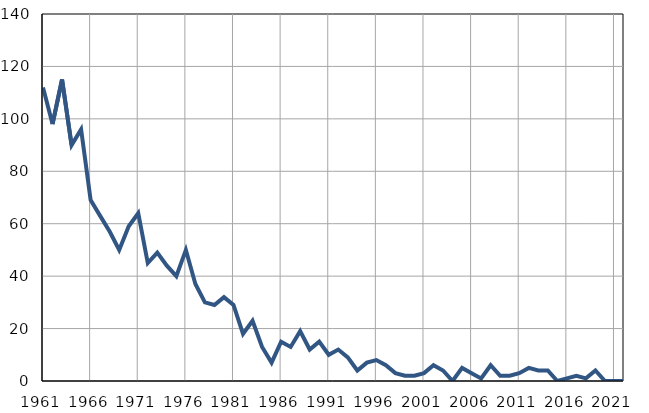
| Category | Infants
deaths |
|---|---|
| 1961.0 | 112 |
| 1962.0 | 98 |
| 1963.0 | 115 |
| 1964.0 | 90 |
| 1965.0 | 96 |
| 1966.0 | 69 |
| 1967.0 | 63 |
| 1968.0 | 57 |
| 1969.0 | 50 |
| 1970.0 | 59 |
| 1971.0 | 64 |
| 1972.0 | 45 |
| 1973.0 | 49 |
| 1974.0 | 44 |
| 1975.0 | 40 |
| 1976.0 | 50 |
| 1977.0 | 37 |
| 1978.0 | 30 |
| 1979.0 | 29 |
| 1980.0 | 32 |
| 1981.0 | 29 |
| 1982.0 | 18 |
| 1983.0 | 23 |
| 1984.0 | 13 |
| 1985.0 | 7 |
| 1986.0 | 15 |
| 1987.0 | 13 |
| 1988.0 | 19 |
| 1989.0 | 12 |
| 1990.0 | 15 |
| 1991.0 | 10 |
| 1992.0 | 12 |
| 1993.0 | 9 |
| 1994.0 | 4 |
| 1995.0 | 7 |
| 1996.0 | 8 |
| 1997.0 | 6 |
| 1998.0 | 3 |
| 1999.0 | 2 |
| 2000.0 | 2 |
| 2001.0 | 3 |
| 2002.0 | 6 |
| 2003.0 | 4 |
| 2004.0 | 0 |
| 2005.0 | 5 |
| 2006.0 | 3 |
| 2007.0 | 1 |
| 2008.0 | 6 |
| 2009.0 | 2 |
| 2010.0 | 2 |
| 2011.0 | 3 |
| 2012.0 | 5 |
| 2013.0 | 4 |
| 2014.0 | 4 |
| 2015.0 | 0 |
| 2016.0 | 1 |
| 2017.0 | 2 |
| 2018.0 | 1 |
| 2019.0 | 4 |
| 2020.0 | 0 |
| 2021.0 | 0 |
| 2022.0 | 0 |